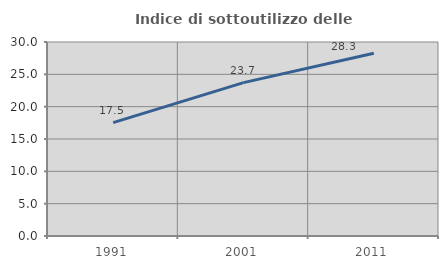
| Category | Indice di sottoutilizzo delle abitazioni  |
|---|---|
| 1991.0 | 17.527 |
| 2001.0 | 23.716 |
| 2011.0 | 28.273 |